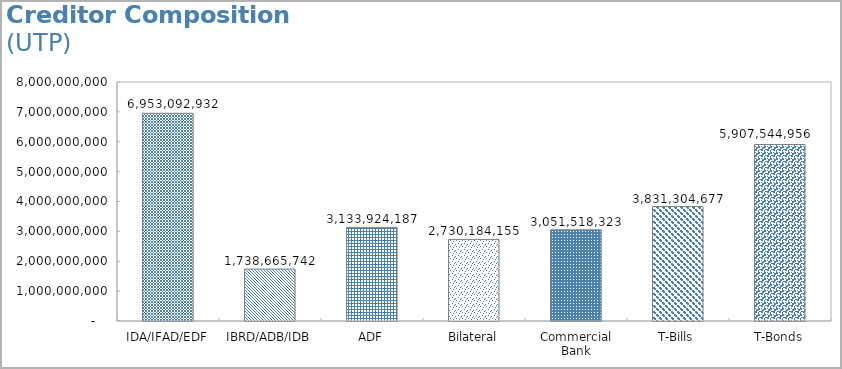
| Category | Debt Oustanding (in UTP) |
|---|---|
| IDA/IFAD/EDF | 6953092931.745 |
| IBRD/ADB/IDB | 1738665741.578 |
| ADF | 3133924187.058 |
| Bilateral | 2730184154.998 |
| Commercial Bank | 3051518323.149 |
| T-Bills | 3831304677 |
| T-Bonds | 5907544956 |